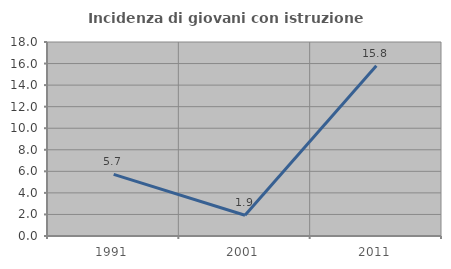
| Category | Incidenza di giovani con istruzione universitaria |
|---|---|
| 1991.0 | 5.714 |
| 2001.0 | 1.923 |
| 2011.0 | 15.789 |